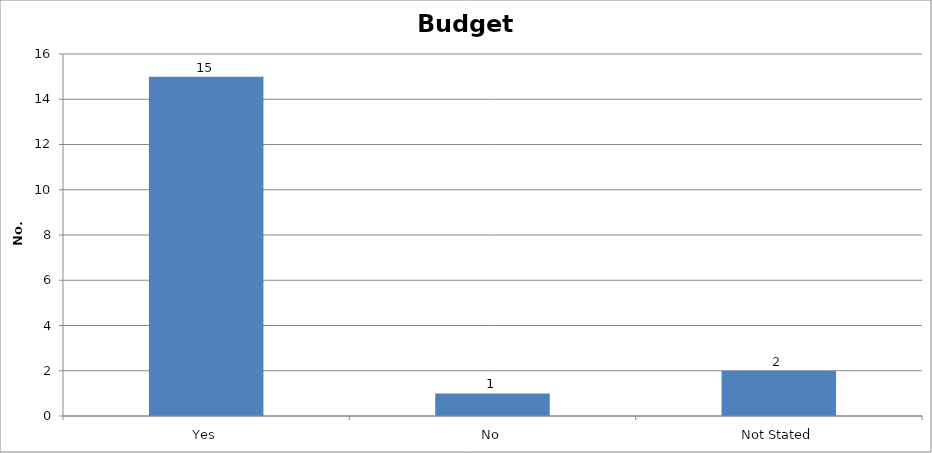
| Category | Series 0 |
|---|---|
| Yes | 15 |
| No | 1 |
| Not Stated | 2 |